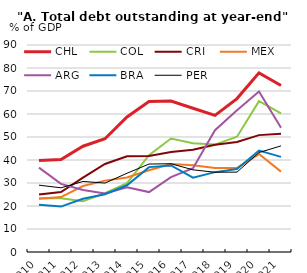
| Category | CHL | COL | CRI | MEX | ARG | BRA | PER |
|---|---|---|---|---|---|---|---|
| 2010.0 | 39.771 | 23.322 | 24.968 | 23.126 | 36.699 | 20.5 | 29.06 |
| 2011.0 | 40.249 | 23.356 | 26.1 | 23.869 | 29.622 | 19.735 | 27.91 |
| 2012.0 | 45.991 | 22.076 | 32.3 | 28.701 | 26.995 | 23.138 | 30.662 |
| 2013.0 | 49.247 | 25.615 | 38.282 | 31.037 | 25.429 | 25.144 | 29.968 |
| 2014.0 | 58.734 | 29.971 | 41.578 | 32.391 | 28.165 | 29.017 | 34.245 |
| 2015.0 | 65.438 | 42.081 | 41.771 | 35.523 | 26.058 | 36.91 | 38.238 |
| 2016.0 | 65.642 | 49.367 | 43.443 | 38.257 | 32.586 | 37.617 | 38.386 |
| 2017.0 | 62.509 | 47.292 | 44.484 | 37.67 | 36.428 | 32.328 | 35.726 |
| 2018.0 | 59.398 | 46.698 | 46.656 | 36.55 | 52.977 | 34.73 | 34.685 |
| 2019.0 | 66.706 | 50.143 | 47.823 | 36.54 | 61.638 | 36.074 | 34.732 |
| 2020.0 | 77.88 | 65.573 | 50.816 | 42.576 | 69.768 | 44.134 | 43.252 |
| 2021.0 | 72.415 | 60.294 | 51.378 | 34.939 | 54 | 41.354 | 46.135 |